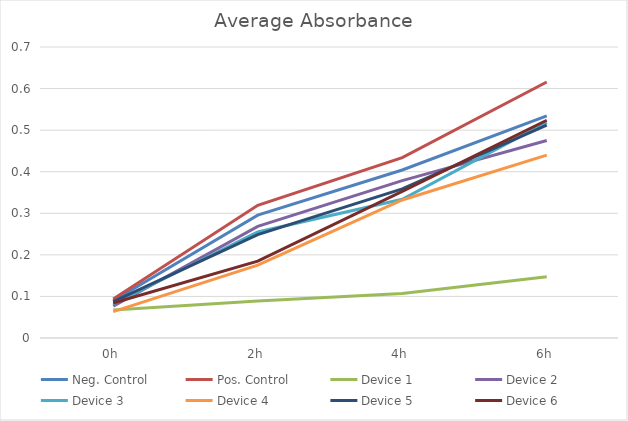
| Category | Neg. Control | Pos. Control | Device 1 | Device 2 | Device 3 | Device 4 | Device 5 | Device 6 |
|---|---|---|---|---|---|---|---|---|
| 0h | 0.089 | 0.094 | 0.067 | 0.077 | 0.082 | 0.064 | 0.087 | 0.084 |
| 2h | 0.296 | 0.319 | 0.089 | 0.268 | 0.255 | 0.175 | 0.249 | 0.185 |
| 4h | 0.404 | 0.434 | 0.107 | 0.379 | 0.334 | 0.332 | 0.359 | 0.353 |
| 6h | 0.534 | 0.616 | 0.147 | 0.475 | 0.519 | 0.44 | 0.512 | 0.524 |